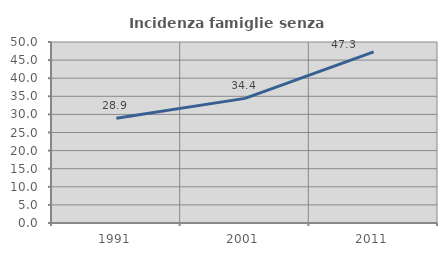
| Category | Incidenza famiglie senza nuclei |
|---|---|
| 1991.0 | 28.931 |
| 2001.0 | 34.426 |
| 2011.0 | 47.266 |